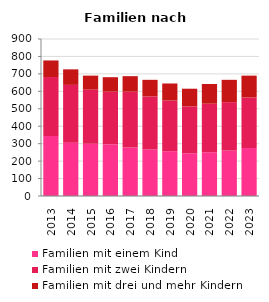
| Category | Familien mit einem Kind | Familien mit zwei Kindern | Familien mit drei und mehr Kindern |
|---|---|---|---|
| 2013.0 | 344 | 338 | 95 |
| 2014.0 | 305 | 332 | 89 |
| 2015.0 | 299 | 311 | 80 |
| 2016.0 | 296 | 302 | 83 |
| 2017.0 | 278 | 320 | 89 |
| 2018.0 | 266 | 305 | 95 |
| 2019.0 | 257 | 290 | 98 |
| 2020.0 | 245 | 269 | 101 |
| 2021.0 | 251 | 278 | 113 |
| 2022.0 | 260 | 278 | 128 |
| 2023.0 | 275 | 290 | 125 |